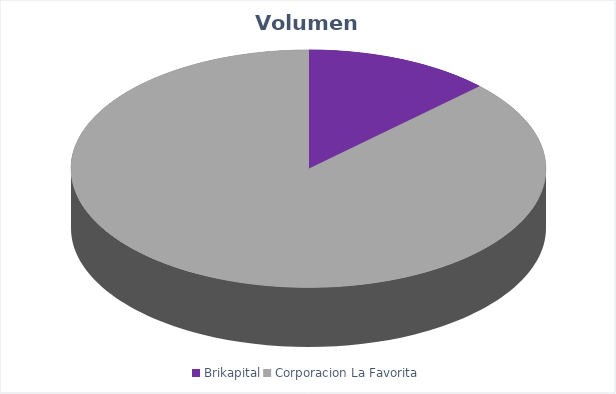
| Category | VOLUMEN ($USD) |
|---|---|
| Brikapital | 23000 |
| Corporacion La Favorita | 156829.1 |